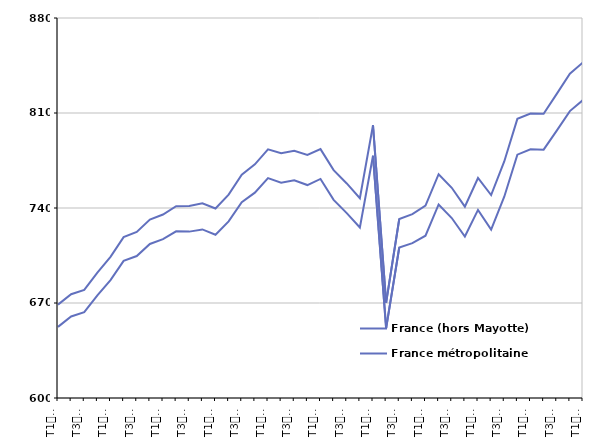
| Category | France (hors Mayotte) | France métropolitaine |
|---|---|---|
| T1
2014 | 668.8 | 652.4 |
| T2
2014 | 676.5 | 660.1 |
| T3
2014 | 679.7 | 663.2 |
| T4
2014 | 692.4 | 675.7 |
| T1
2015 | 704 | 686.9 |
| T2
2015 | 718.5 | 701 |
| T3
2015 | 722.4 | 704.6 |
| T4
2015 | 731.5 | 713.5 |
| T1
2016 | 735.2 | 717 |
| T2
2016 | 741.3 | 722.8 |
| T3
2016 | 741.4 | 722.6 |
| T4
2016 | 743.5 | 724.2 |
| T1
2017 | 739.6 | 720.3 |
| T2
2017 | 749.9 | 730.1 |
| T3
2017 | 764.5 | 744.2 |
| T4
2017 | 772.2 | 751.3 |
| T1
2018 | 783.2 | 762 |
| T2
2018 | 780.4 | 758.7 |
| T3
2018 | 782.1 | 760.4 |
| T4
2018 | 779.1 | 756.9 |
| T1
2019 | 783.4 | 761.4 |
| T2
2019 | 767.9 | 746 |
| T3
2019 | 758.1 | 736.2 |
| T4
2019 | 747.2 | 725.6 |
| T1
2020 | 801 | 778.5 |
| T2
2020 | 670.3 | 651.5 |
| T3
2020 | 731.9 | 710.9 |
| T4
2020 | 735.5 | 714.1 |
| T1
2021 | 741.7 | 719.6 |
| T2
2021 | 764.9 | 742.6 |
| T3
2021 | 754.9 | 732.6 |
| T4
2021 | 741 | 719 |
| T1
2022 | 762.1 | 738.6 |
| T2
2022 | 749.5 | 724.1 |
| T3
2022 | 774.3 | 748.3 |
| T4
2022 | 805.7 | 779.3 |
| T1
2023 | 809.6 | 783.2 |
| T2
2023 | 809.4 | 783 |
| T3
2023 | 824.1 | 797 |
| T4
2023 | 839 | 811.4 |
| T1
2024 | 847.3 | 819.6 |